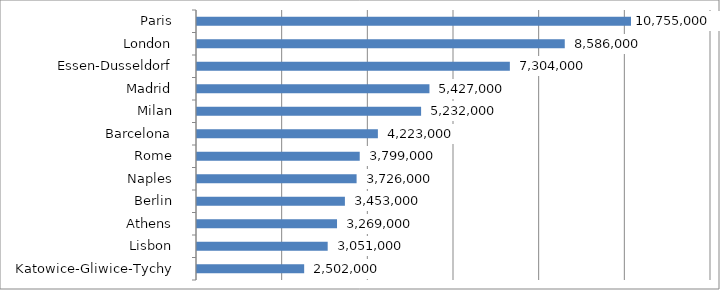
| Category | Series 0 |
|---|---|
|  Paris   | 10755000 |
|  London   | 8586000 |
|  Essen-Dusseldorf   | 7304000 |
|  Madrid   | 5427000 |
|  Milan   | 5232000 |
|  Barcelona   | 4223000 |
|  Rome   | 3799000 |
|  Naples   | 3726000 |
|  Berlin   | 3453000 |
|  Athens   | 3269000 |
|  Lisbon   | 3051000 |
|  Katowice-Gliwice-Tychy   | 2502000 |